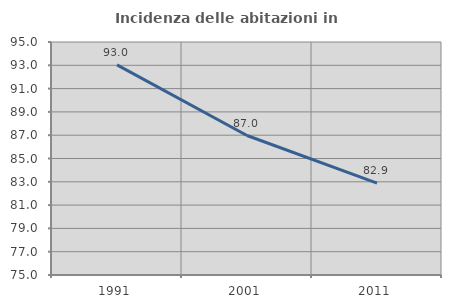
| Category | Incidenza delle abitazioni in proprietà  |
|---|---|
| 1991.0 | 93.04 |
| 2001.0 | 86.972 |
| 2011.0 | 82.886 |